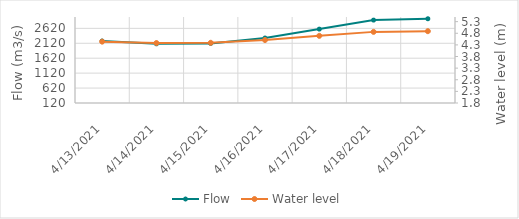
| Category | Flow |
|---|---|
| 4/18/21 | 2874.5 |
| 4/17/21 | 2628.11 |
| 4/16/21 | 2296.24 |
| 4/15/21 | 2116.1 |
| 4/14/21 | 2101.35 |
| 4/13/21 | 2195.79 |
| 4/12/21 | 2496.86 |